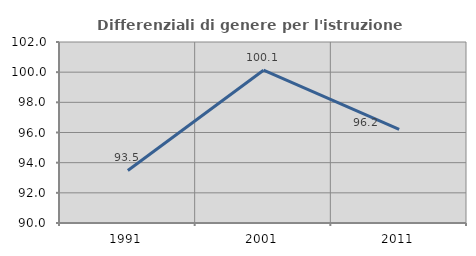
| Category | Differenziali di genere per l'istruzione superiore |
|---|---|
| 1991.0 | 93.481 |
| 2001.0 | 100.128 |
| 2011.0 | 96.202 |